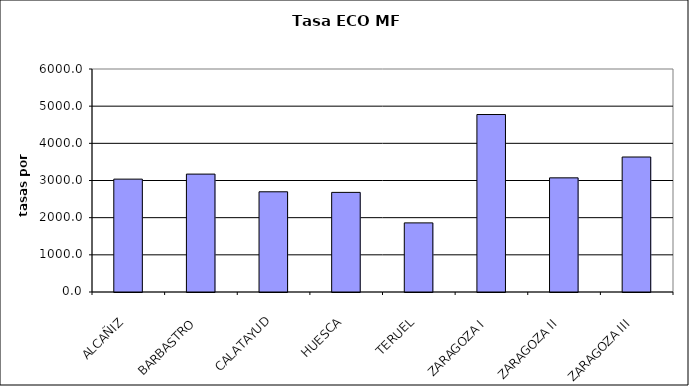
| Category | Series 0 |
|---|---|
| ALCAÑIZ | 3036.615 |
| BARBASTRO | 3172.302 |
| CALATAYUD | 2696.162 |
| HUESCA | 2680.18 |
| TERUEL | 1859.453 |
| ZARAGOZA I | 4775.313 |
| ZARAGOZA II | 3071.134 |
| ZARAGOZA III | 3632.181 |